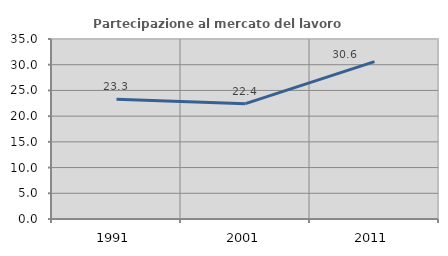
| Category | Partecipazione al mercato del lavoro  femminile |
|---|---|
| 1991.0 | 23.264 |
| 2001.0 | 22.433 |
| 2011.0 | 30.603 |